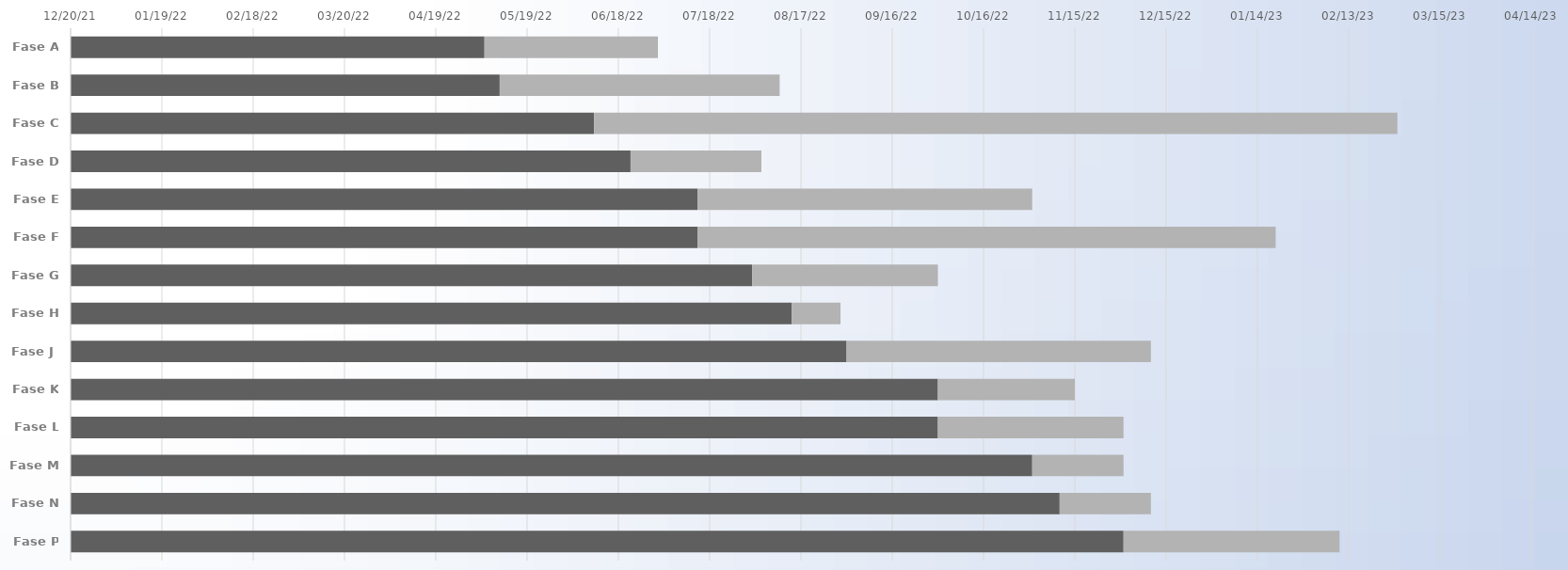
| Category | INÍCIO | Duração |
|---|---|---|
| Fase A | 2022-05-05 | 57 |
| Fase B | 2022-05-10 | 92 |
| Fase C | 2022-06-10 | 264 |
| Fase D | 2022-06-22 | 43 |
| Fase E | 2022-07-14 | 110 |
| Fase F | 2022-07-14 | 190 |
| Fase G | 2022-08-01 | 61 |
| Fase H | 2022-08-14 | 16 |
| Fase J | 2022-09-01 | 100 |
| Fase K | 2022-10-01 | 45 |
| Fase L | 2022-10-01 | 61 |
| Fase M | 2022-11-01 | 30 |
| Fase N | 2022-11-10 | 30 |
| Fase P | 2022-12-01 | 71 |